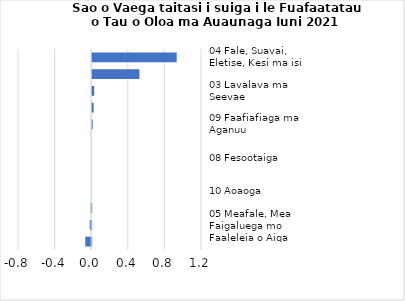
| Category |     Contributions |
|---|---|
| 04 Fale, Suavai, Eletise, Kesi ma isi | 0.923 |
| 01 Meaai ma Vaiinu | 0.516 |
| 03 Lavalava ma Seevae | 0.021 |
| 02 Ava Malosi ma Tapaa | 0.016 |
| 09 Faafiafiaga ma Aganuu | 0.006 |
| 06 Soifua Maloloina | 0 |
| 08 Fesootaiga | 0 |
| 11 Faleaiga | 0 |
| 10 Aoaoga | 0 |
| 07 Femalagaiga | -0.006 |
| 05 Meafale, Mea Faigaluega mo Faaleleia o Aiga | -0.017 |
| 12 Isi Oloa ma Auaunaga | -0.065 |